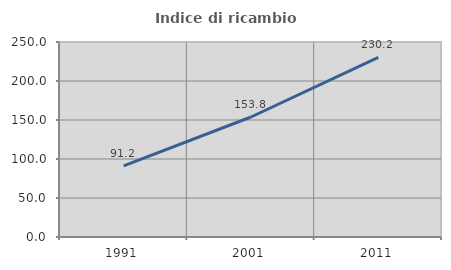
| Category | Indice di ricambio occupazionale  |
|---|---|
| 1991.0 | 91.228 |
| 2001.0 | 153.846 |
| 2011.0 | 230.189 |